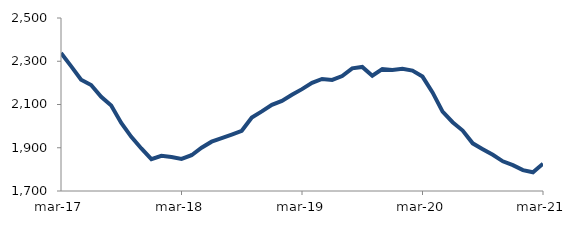
| Category | Series 0 |
|---|---|
| 2017-03-01 | 2337.875 |
| 2017-04-01 | 2277.502 |
| 2017-05-01 | 2214.947 |
| 2017-06-01 | 2189.913 |
| 2017-07-01 | 2135.222 |
| 2017-08-01 | 2094.94 |
| 2017-09-01 | 2014.396 |
| 2017-10-01 | 1950.352 |
| 2017-11-01 | 1896.561 |
| 2017-12-01 | 1847.168 |
| 2018-01-01 | 1862.893 |
| 2018-02-01 | 1856.984 |
| 2018-03-01 | 1848.55 |
| 2018-04-01 | 1865.355 |
| 2018-05-01 | 1900.2 |
| 2018-06-01 | 1928.056 |
| 2018-07-01 | 1944.547 |
| 2018-08-01 | 1961.063 |
| 2018-09-01 | 1978.33 |
| 2018-10-01 | 2039.84 |
| 2018-11-01 | 2068.021 |
| 2018-12-01 | 2098.706 |
| 2019-01-01 | 2116.727 |
| 2019-02-01 | 2144.876 |
| 2019-03-01 | 2171.077 |
| 2019-04-01 | 2199.941 |
| 2019-05-01 | 2218.125 |
| 2019-06-01 | 2213.708 |
| 2019-07-01 | 2231.834 |
| 2019-08-01 | 2267.321 |
| 2019-09-01 | 2273.768 |
| 2019-10-01 | 2233.304 |
| 2019-11-01 | 2263.898 |
| 2019-12-01 | 2259.926 |
| 2020-01-01 | 2265.053 |
| 2020-02-01 | 2256.766 |
| 2020-03-01 | 2229.161 |
| 2020-04-01 | 2155.791 |
| 2020-05-01 | 2066.843 |
| 2020-06-01 | 2018.026 |
| 2020-07-01 | 1979.558 |
| 2020-08-01 | 1920.368 |
| 2020-09-01 | 1893.237 |
| 2020-10-01 | 1867.4 |
| 2020-11-01 | 1837.195 |
| 2020-12-01 | 1819.546 |
| 2021-01-01 | 1796.45 |
| 2021-02-01 | 1786.603 |
| 2021-03-01 | 1826.072 |